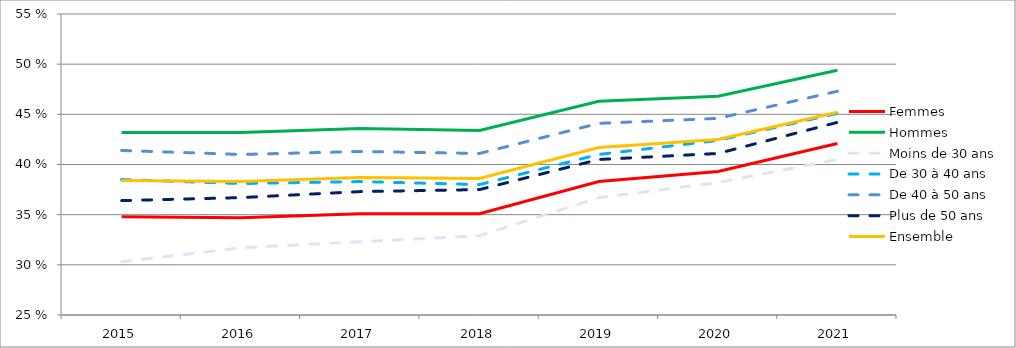
| Category | Femmes | Hommes | Moins de 30 ans | De 30 à 40 ans | De 40 à 50 ans | Plus de 50 ans | Ensemble |
|---|---|---|---|---|---|---|---|
| 2015 | 0.348 | 0.432 | 0.303 | 0.385 | 0.414 | 0.364 | 0.384 |
| 2016 | 0.347 | 0.432 | 0.317 | 0.381 | 0.41 | 0.367 | 0.383 |
| 2017 | 0.351 | 0.436 | 0.323 | 0.383 | 0.413 | 0.373 | 0.387 |
| 2018 | 0.351 | 0.434 | 0.329 | 0.38 | 0.411 | 0.375 | 0.386 |
| 2019 | 0.383 | 0.463 | 0.367 | 0.41 | 0.441 | 0.405 | 0.417 |
| 2020 | 0.393 | 0.468 | 0.382 | 0.424 | 0.446 | 0.411 | 0.425 |
| 2021 | 0.421 | 0.494 | 0.405 | 0.451 | 0.473 | 0.442 | 0.452 |